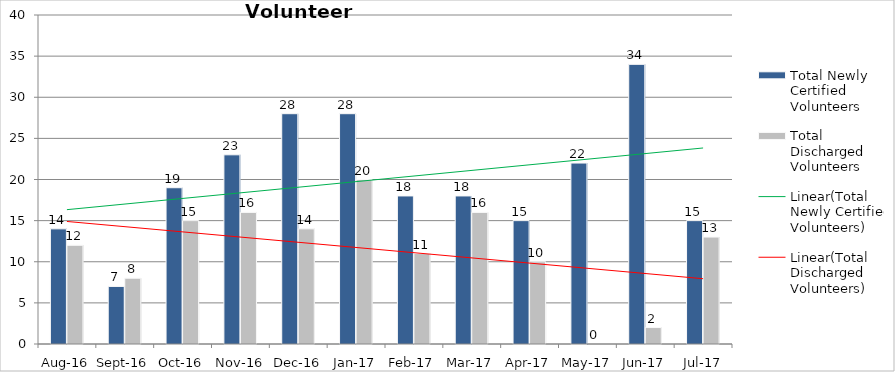
| Category | Total Newly Certified Volunteers | Total Discharged Volunteers |
|---|---|---|
| Aug-16 | 14 | 12 |
| Sep-16 | 7 | 8 |
| Oct-16 | 19 | 15 |
| Nov-16 | 23 | 16 |
| Dec-16 | 28 | 14 |
| Jan-17 | 28 | 20 |
| Feb-17 | 18 | 11 |
| Mar-17 | 18 | 16 |
| Apr-17 | 15 | 10 |
| May-17 | 22 | 0 |
| Jun-17 | 34 | 2 |
| Jul-17 | 15 | 13 |